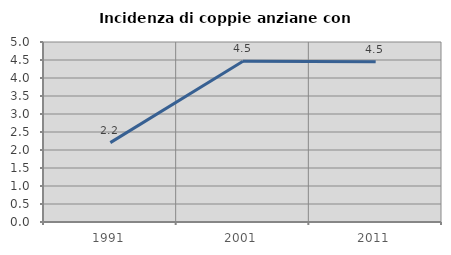
| Category | Incidenza di coppie anziane con figli |
|---|---|
| 1991.0 | 2.205 |
| 2001.0 | 4.463 |
| 2011.0 | 4.452 |